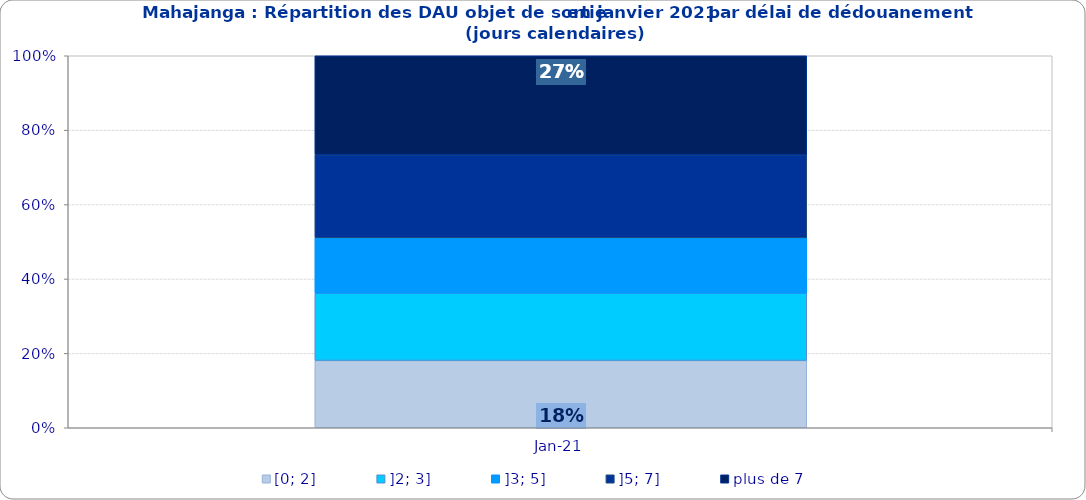
| Category | [0; 2] | ]2; 3] | ]3; 5] | ]5; 7] | plus de 7 |
|---|---|---|---|---|---|
| 2021-01-01 | 0.181 | 0.181 | 0.149 | 0.223 | 0.266 |